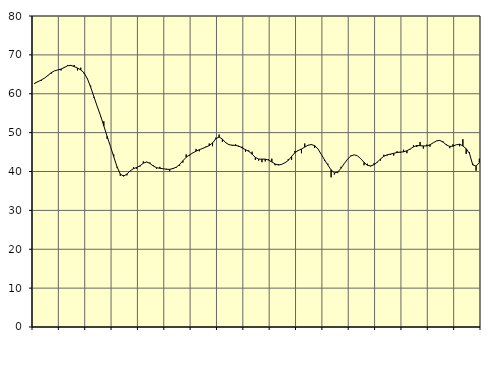
| Category | Piggar | Series 1 |
|---|---|---|
| nan | 62.5 | 62.7 |
| 87.0 | 63.2 | 63.11 |
| 87.0 | 63.3 | 63.54 |
| 87.0 | 64 | 64.03 |
| nan | 64.8 | 64.68 |
| 88.0 | 65.1 | 65.38 |
| 88.0 | 65.9 | 65.88 |
| 88.0 | 66.1 | 66.11 |
| nan | 66 | 66.35 |
| 89.0 | 66.9 | 66.74 |
| 89.0 | 67.4 | 67.2 |
| 89.0 | 67.4 | 67.29 |
| nan | 67.4 | 67 |
| 90.0 | 66 | 66.6 |
| 90.0 | 66.7 | 66.13 |
| 90.0 | 65.2 | 65.37 |
| nan | 63.8 | 63.88 |
| 91.0 | 62.1 | 61.71 |
| 91.0 | 59 | 59.21 |
| 91.0 | 56.8 | 56.75 |
| nan | 54.2 | 54.37 |
| 92.0 | 52.9 | 51.74 |
| 92.0 | 48.4 | 49.04 |
| 92.0 | 46.5 | 46.48 |
| nan | 44.4 | 43.83 |
| 93.0 | 41 | 41.22 |
| 93.0 | 38.9 | 39.34 |
| 93.0 | 39.1 | 38.81 |
| nan | 39 | 39.35 |
| 94.0 | 40.1 | 40.16 |
| 94.0 | 41.1 | 40.73 |
| 94.0 | 40.7 | 41.04 |
| nan | 41.3 | 41.48 |
| 95.0 | 42.6 | 42.14 |
| 95.0 | 42.4 | 42.46 |
| 95.0 | 42.3 | 42.08 |
| nan | 41.6 | 41.42 |
| 96.0 | 40.7 | 40.98 |
| 96.0 | 41.2 | 40.83 |
| 96.0 | 40.7 | 40.71 |
| nan | 40.7 | 40.57 |
| 97.0 | 40.1 | 40.56 |
| 97.0 | 40.9 | 40.76 |
| 97.0 | 41 | 41.12 |
| nan | 41.5 | 41.79 |
| 98.0 | 42.3 | 42.76 |
| 98.0 | 44.4 | 43.66 |
| 98.0 | 44.1 | 44.25 |
| nan | 44.8 | 44.76 |
| 99.0 | 45.8 | 45.23 |
| 99.0 | 45.2 | 45.61 |
| 99.0 | 45.8 | 45.94 |
| nan | 46.4 | 46.3 |
| 0.0 | 47.2 | 46.65 |
| 0.0 | 46.5 | 47.35 |
| 0.0 | 48.7 | 48.41 |
| nan | 49.5 | 48.86 |
| 1.0 | 47.6 | 48.33 |
| 1.0 | 47.5 | 47.39 |
| 1.0 | 46.9 | 46.9 |
| nan | 46.6 | 46.77 |
| 2.0 | 47 | 46.7 |
| 2.0 | 46.3 | 46.53 |
| 2.0 | 46.4 | 46.06 |
| nan | 45.1 | 45.61 |
| 3.0 | 45.4 | 45.19 |
| 3.0 | 45.1 | 44.46 |
| 3.0 | 43 | 43.64 |
| nan | 42.8 | 43.19 |
| 4.0 | 42.4 | 43.18 |
| 4.0 | 42.6 | 43.19 |
| 4.0 | 43.2 | 42.94 |
| nan | 43.3 | 42.46 |
| 5.0 | 41.6 | 41.93 |
| 5.0 | 41.9 | 41.66 |
| 5.0 | 41.8 | 41.84 |
| nan | 42.2 | 42.25 |
| 6.0 | 43.2 | 42.86 |
| 6.0 | 43 | 43.87 |
| 6.0 | 45.3 | 44.83 |
| nan | 45.5 | 45.4 |
| 7.0 | 44.7 | 45.79 |
| 7.0 | 47.2 | 46.28 |
| 7.0 | 46.7 | 46.77 |
| nan | 47 | 46.92 |
| 8.0 | 46.1 | 46.66 |
| 8.0 | 45.8 | 45.82 |
| 8.0 | 44.4 | 44.41 |
| nan | 42.7 | 43.01 |
| 9.0 | 42 | 41.67 |
| 9.0 | 38.5 | 40.42 |
| 9.0 | 39.2 | 39.65 |
| nan | 39.6 | 39.85 |
| 10.0 | 41.2 | 40.83 |
| 10.0 | 42 | 42.04 |
| 10.0 | 43.2 | 43.17 |
| nan | 44.1 | 43.99 |
| 11.0 | 44.3 | 44.3 |
| 11.0 | 44 | 44.01 |
| 11.0 | 43.3 | 43.3 |
| nan | 41.6 | 42.35 |
| 12.0 | 42 | 41.6 |
| 12.0 | 41.3 | 41.43 |
| 12.0 | 42.1 | 41.73 |
| nan | 42.5 | 42.38 |
| 13.0 | 42.8 | 43.22 |
| 13.0 | 44.3 | 43.92 |
| 13.0 | 44.1 | 44.28 |
| nan | 44.3 | 44.47 |
| 14.0 | 44.1 | 44.67 |
| 14.0 | 45.2 | 44.89 |
| 14.0 | 44.8 | 45 |
| nan | 45.6 | 45.06 |
| 15.0 | 44.7 | 45.33 |
| 15.0 | 45.7 | 45.79 |
| 15.0 | 46.8 | 46.34 |
| nan | 46.3 | 46.68 |
| 16.0 | 47.6 | 46.65 |
| 16.0 | 45.9 | 46.57 |
| 16.0 | 46.9 | 46.58 |
| nan | 46.4 | 46.87 |
| 17.0 | 47.4 | 47.39 |
| 17.0 | 47.9 | 47.86 |
| 17.0 | 47.9 | 48 |
| nan | 47.7 | 47.56 |
| 18.0 | 47 | 46.84 |
| 18.0 | 46 | 46.45 |
| 18.0 | 47 | 46.52 |
| nan | 46.9 | 46.88 |
| 19.0 | 46.5 | 47.02 |
| 19.0 | 48.3 | 46.58 |
| 19.0 | 44.5 | 45.87 |
| nan | 45 | 44.64 |
| 20.0 | 42 | 41.7 |
| 20.0 | 40.2 | 41.38 |
| 20.0 | 43.3 | 42.29 |